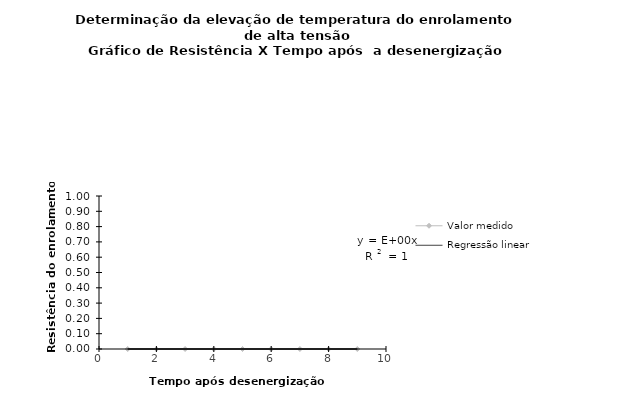
| Category | Valor medido |
|---|---|
| 0.0 | 0 |
| 0.0 | 0 |
| 0.0 | 0 |
| 0.0 | 0 |
| 0.0 | 0 |
| 0.0 | 0 |
| 0.0 | 0 |
| 0.0 | 0 |
| 0.0 | 0 |